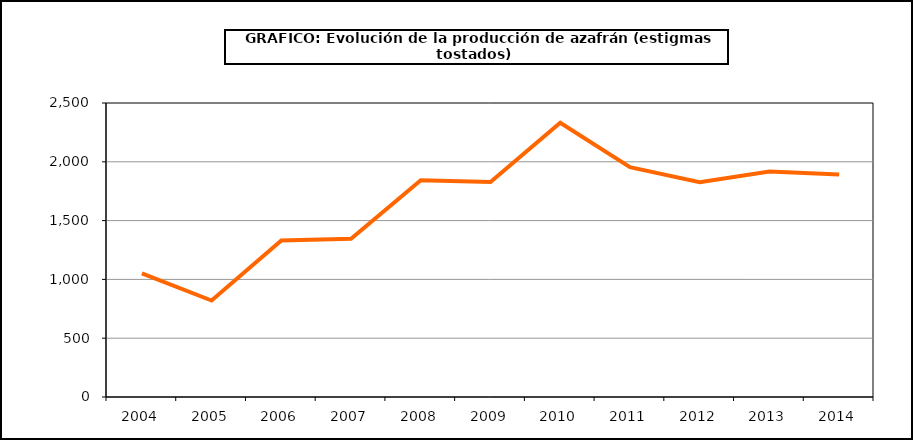
| Category | Producción |
|---|---|
| 2004.0 | 1051 |
| 2005.0 | 820 |
| 2006.0 | 1330 |
| 2007.0 | 1345 |
| 2008.0 | 1843 |
| 2009.0 | 1829 |
| 2010.0 | 2332 |
| 2011.0 | 1954 |
| 2012.0 | 1827 |
| 2013.0 | 1918 |
| 2014.0 | 1892 |